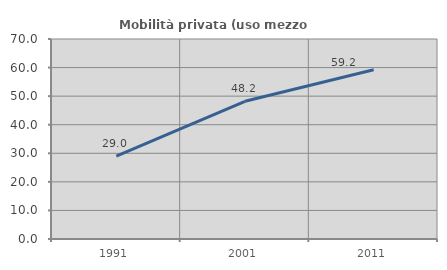
| Category | Mobilità privata (uso mezzo privato) |
|---|---|
| 1991.0 | 29.01 |
| 2001.0 | 48.196 |
| 2011.0 | 59.249 |